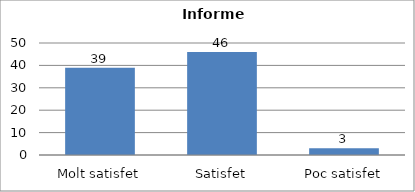
| Category | Series 0 |
|---|---|
| Molt satisfet | 39 |
| Satisfet | 46 |
| Poc satisfet | 3 |